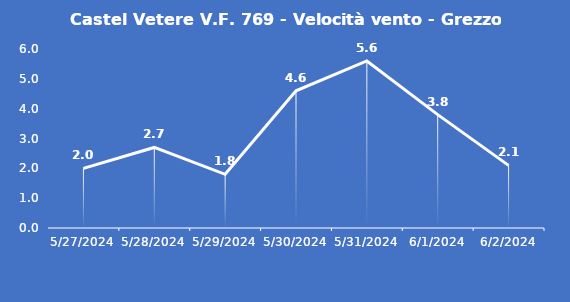
| Category | Castel Vetere V.F. 769 - Velocità vento - Grezzo (m/s) |
|---|---|
| 5/27/24 | 2 |
| 5/28/24 | 2.7 |
| 5/29/24 | 1.8 |
| 5/30/24 | 4.6 |
| 5/31/24 | 5.6 |
| 6/1/24 | 3.8 |
| 6/2/24 | 2.1 |